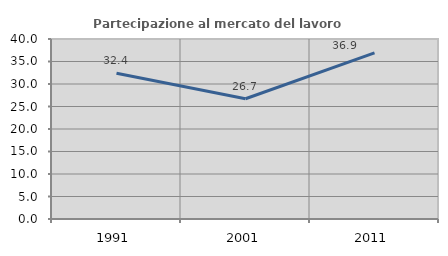
| Category | Partecipazione al mercato del lavoro  femminile |
|---|---|
| 1991.0 | 32.37 |
| 2001.0 | 26.715 |
| 2011.0 | 36.914 |